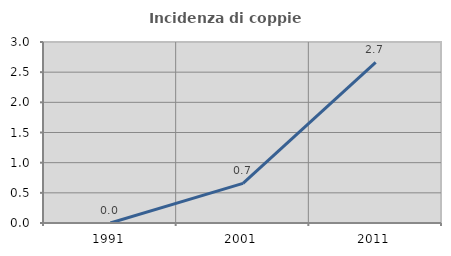
| Category | Incidenza di coppie miste |
|---|---|
| 1991.0 | 0 |
| 2001.0 | 0.656 |
| 2011.0 | 2.661 |